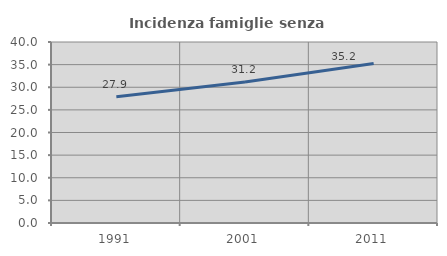
| Category | Incidenza famiglie senza nuclei |
|---|---|
| 1991.0 | 27.913 |
| 2001.0 | 31.152 |
| 2011.0 | 35.23 |